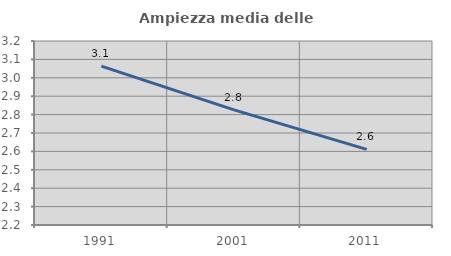
| Category | Ampiezza media delle famiglie |
|---|---|
| 1991.0 | 3.063 |
| 2001.0 | 2.826 |
| 2011.0 | 2.611 |